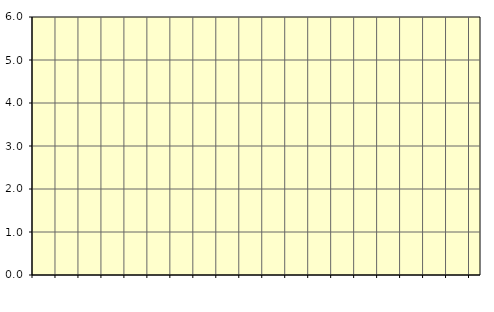
| Category | Piggar | Transport, SNI 49-53 |
|---|---|---|
| nan | 8.1 | 8.05 |
| 1.0 | 7.9 | 7.96 |
| 1.0 | 7.9 | 7.86 |
| 1.0 | 7.7 | 7.79 |
| nan | 7.8 | 7.79 |
| 2.0 | 7.9 | 7.83 |
| 2.0 | 7.8 | 7.87 |
| 2.0 | 8 | 7.87 |
| nan | 7.8 | 7.8 |
| 3.0 | 7.8 | 7.69 |
| 3.0 | 7.5 | 7.59 |
| 3.0 | 7.6 | 7.49 |
| nan | 7.4 | 7.41 |
| 4.0 | 7.3 | 7.33 |
| 4.0 | 7.4 | 7.24 |
| 4.0 | 7 | 7.19 |
| nan | 7.2 | 7.23 |
| 5.0 | 7.3 | 7.33 |
| 5.0 | 7.5 | 7.4 |
| 5.0 | 7.4 | 7.43 |
| nan | 7.5 | 7.43 |
| 6.0 | 7.4 | 7.46 |
| 6.0 | 7.4 | 7.52 |
| 6.0 | 7.6 | 7.58 |
| nan | 7.5 | 7.62 |
| 7.0 | 7.7 | 7.65 |
| 7.0 | 7.7 | 7.72 |
| 7.0 | 7.8 | 7.74 |
| nan | 7.7 | 7.68 |
| 8.0 | 7.5 | 7.54 |
| 8.0 | 7.5 | 7.4 |
| 8.0 | 7.2 | 7.3 |
| nan | 7.2 | 7.25 |
| 9.0 | 7.2 | 7.25 |
| 9.0 | 7.4 | 7.3 |
| 9.0 | 7.4 | 7.42 |
| nan | 7.7 | 7.58 |
| 10.0 | 7.8 | 7.71 |
| 10.0 | 7.7 | 7.79 |
| 10.0 | 7.9 | 7.8 |
| nan | 7.8 | 7.74 |
| 11.0 | 7.6 | 7.63 |
| 11.0 | 7.5 | 7.53 |
| 11.0 | 7.5 | 7.49 |
| nan | 7.4 | 7.47 |
| 12.0 | 7.5 | 7.45 |
| 12.0 | 7.4 | 7.47 |
| 12.0 | 7.5 | 7.54 |
| nan | 7.6 | 7.66 |
| 13.0 | 7.8 | 7.75 |
| 13.0 | 7.7 | 7.76 |
| 13.0 | 7.7 | 7.71 |
| nan | 7.7 | 7.71 |
| 14.0 | 7.6 | 7.77 |
| 14.0 | 8 | 7.81 |
| 14.0 | 7.6 | 7.76 |
| nan | 7.7 | 7.68 |
| 15.0 | 7.6 | 7.64 |
| 15.0 | 7.7 | 7.63 |
| 15.0 | 7.6 | 7.61 |
| nan | 7.6 | 7.58 |
| 16.0 | 7.6 | 7.59 |
| 16.0 | 7.6 | 7.63 |
| 16.0 | 7.8 | 7.71 |
| nan | 7.7 | 7.77 |
| 17.0 | 7.8 | 7.81 |
| 17.0 | 7.8 | 7.84 |
| 17.0 | 7.8 | 7.87 |
| nan | 7.9 | 7.85 |
| 18.0 | 7.9 | 7.75 |
| 18.0 | 7.5 | 7.67 |
| 18.0 | 7.9 | 7.68 |
| nan | 7.8 | 7.8 |
| 19.0 | 7.7 | 7.94 |
| 19.0 | 8.2 | 7.98 |
| 19.0 | 7.7 | 7.93 |
| nan | 7.6 | 7.66 |
| 20.0 | 6.4 | 6.5 |